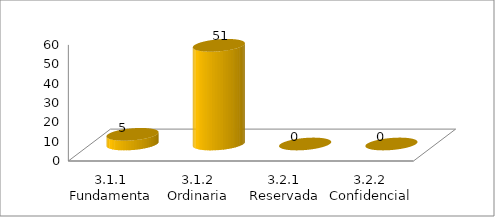
| Category | Series 0 |
|---|---|
| 3.1.1 Fundamental | 5 |
| 3.1.2 Ordinaria | 51 |
| 3.2.1 Reservada | 0 |
| 3.2.2 Confidencial | 0 |